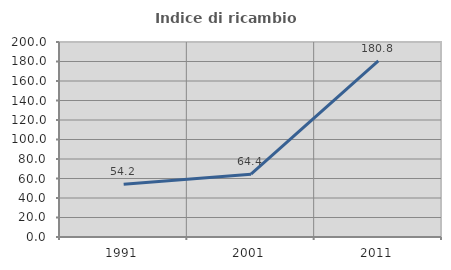
| Category | Indice di ricambio occupazionale  |
|---|---|
| 1991.0 | 54.156 |
| 2001.0 | 64.428 |
| 2011.0 | 180.755 |